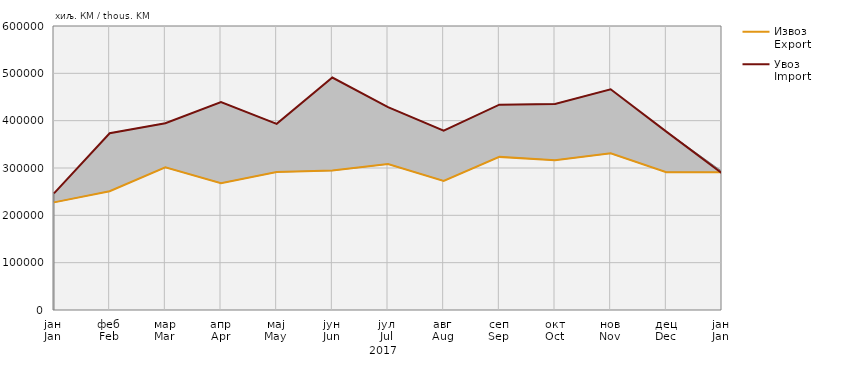
| Category | Извоз
Export | Увоз
Import |
|---|---|---|
| јан
Jan | 227374 | 246344 |
| феб
Feb | 250969 | 373425 |
| мар
Mar | 301409 | 394461 |
| апр
Apr | 267973 | 439231 |
| мај
May | 291490 | 393257 |
| јун
Jun | 294506 | 491152 |
| јул
Jul | 308275 | 428722 |
| авг
Aug | 272830 | 378735 |
| сеп
Sep | 323479 | 433731 |
| окт
Oct | 316474 | 435293 |
| нов
Nov | 330900 | 466301 |
| дец
Dec | 291210 | 376925 |
| јан
Jan | 290873 | 288843 |